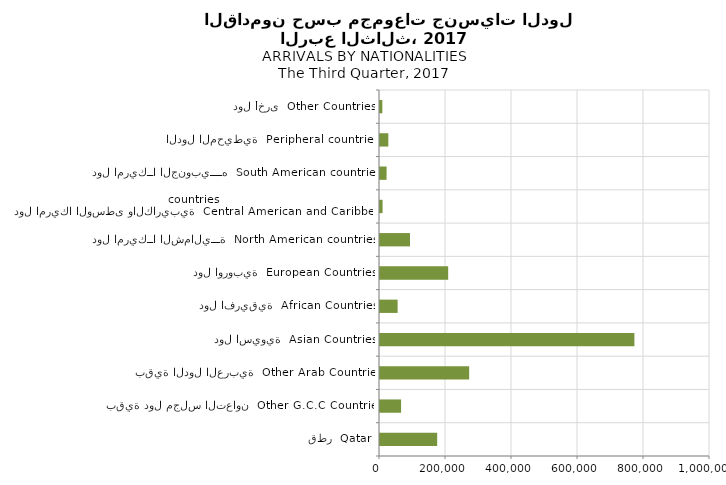
| Category | Series 0 |
|---|---|
| قطر  Qatar | 173253 |
| بقية دول مجلس التعاون  Other G.C.C Countries | 63890 |
| بقية الدول العربية  Other Arab Countries | 270196 |
| دول اسيوية  Asian Countries | 770897 |
| دول افريقية  African Countries | 53414 |
| دول اوروبية  European Countries | 206562 |
| دول امريكــا الشماليـــة  North American countries  | 90824 |
| دول امريكا الوسطى والكاريبية  Central American and Caribbean countries | 7773 |
| دول امريكــا الجنوبيــــه  South American countries | 19915 |
| الدول المحيطية  Peripheral countries | 25225 |
| دول أخرى  Other Countries | 7030 |